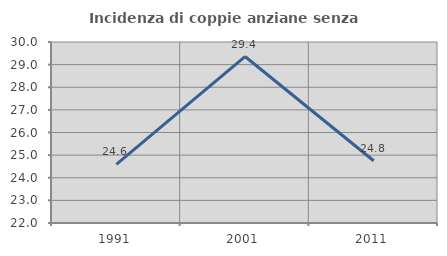
| Category | Incidenza di coppie anziane senza figli  |
|---|---|
| 1991.0 | 24.59 |
| 2001.0 | 29.358 |
| 2011.0 | 24.752 |